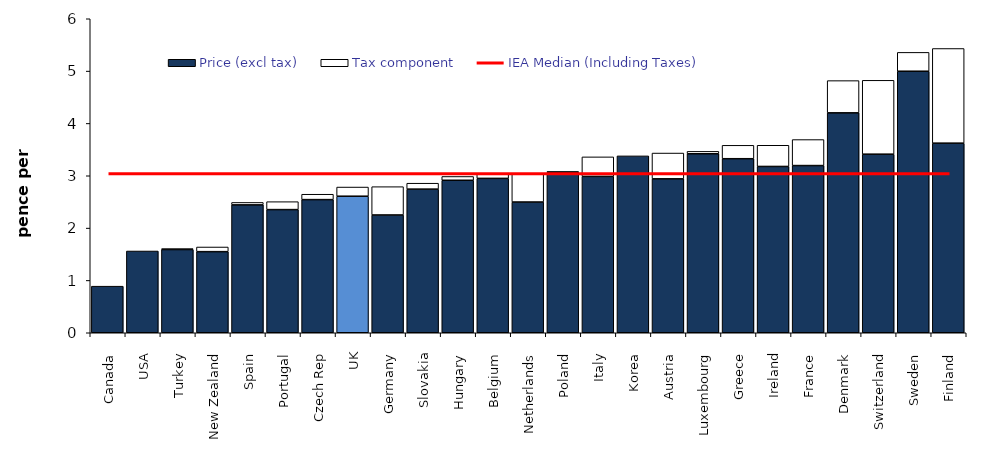
| Category | Price (excl tax) | Tax component |
|---|---|---|
|  Canada  | 0.89 | 0 |
|  USA  | 1.562 | 0 |
|  Turkey  | 1.59 | 0.018 |
|  New Zealand  | 1.55 | 0.089 |
|  Spain  | 2.444 | 0.046 |
|  Portugal  | 2.354 | 0.151 |
|  Czech Rep  | 2.544 | 0.103 |
|  UK  | 2.609 | 0.175 |
|  Germany  | 2.25 | 0.541 |
|  Slovakia  | 2.744 | 0.113 |
|  Hungary  | 2.914 | 0.073 |
|  Belgium  | 2.95 | 0.093 |
|  Netherlands  | 2.498 | 0.546 |
|  Poland  | 3.065 | 0.017 |
|  Italy  | 2.988 | 0.373 |
|  Korea  | 3.38 | 0 |
|  Austria  | 2.941 | 0.493 |
|  Luxembourg  | 3.42 | 0.046 |
|  Greece  | 3.326 | 0.256 |
|  Ireland  | 3.178 | 0.405 |
|  France  | 3.195 | 0.497 |
|  Denmark  | 4.202 | 0.616 |
|  Switzerland  | 3.412 | 1.412 |
|  Sweden  | 4.997 | 0.36 |
|  Finland  | 3.623 | 1.809 |